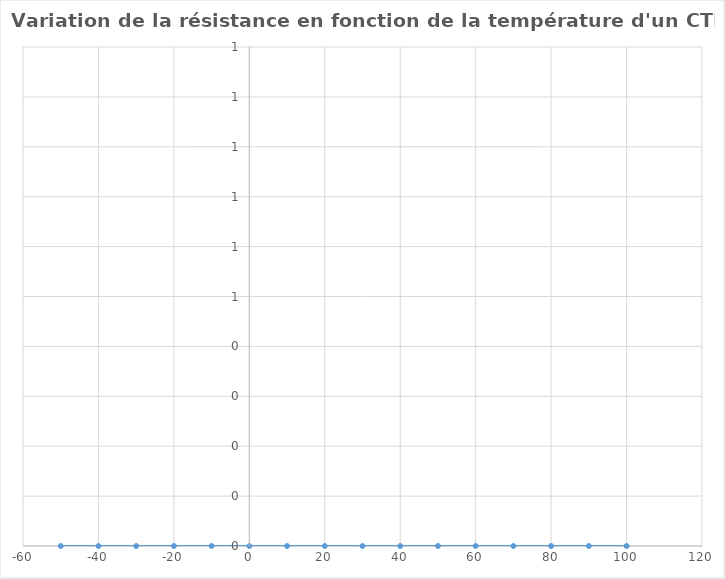
| Category | Series 0 |
|---|---|
| -50.0 | 0 |
| -40.0 | 0 |
| -30.0 | 0 |
| -20.0 | 0 |
| -10.0 | 0 |
| 0.0 | 0 |
| 10.0 | 0 |
| 20.0 | 0 |
| 30.0 | 0 |
| 40.0 | 0 |
| 50.0 | 0 |
| 60.0 | 0 |
| 70.0 | 0 |
| 80.0 | 0 |
| 90.0 | 0 |
| 100.0 | 0 |